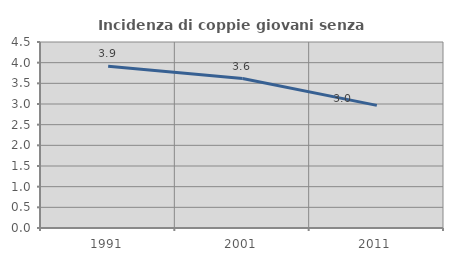
| Category | Incidenza di coppie giovani senza figli |
|---|---|
| 1991.0 | 3.914 |
| 2001.0 | 3.616 |
| 2011.0 | 2.966 |